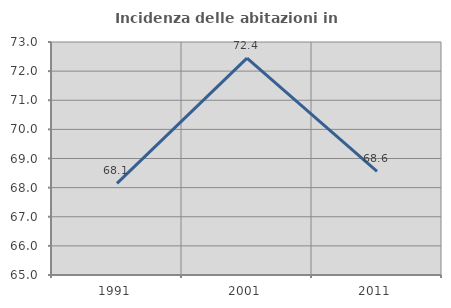
| Category | Incidenza delle abitazioni in proprietà  |
|---|---|
| 1991.0 | 68.148 |
| 2001.0 | 72.447 |
| 2011.0 | 68.56 |